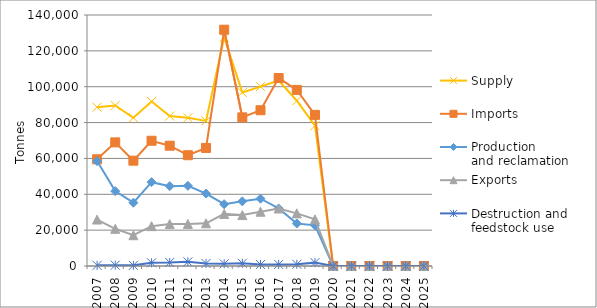
| Category | Supply | Imports | Production 
and reclamation | Exports | Destruction and 
feedstock use |
|---|---|---|---|---|---|
| 2007.0 | 88586.168 | 59518.488 | 58514.898 | 25914.962 | 349.388 |
| 2008.0 | 89568.834 | 68948.237 | 41757.375 | 20742.233 | 478.922 |
| 2009.0 | 82680.854 | 58746.203 | 35299.543 | 17168.292 | 356.814 |
| 2010.0 | 91748.751 | 69858.093 | 46766.357 | 22232.764 | 1803.092 |
| 2011.0 | 83620.143 | 67093.941 | 44538.196 | 23382.669 | 1954.313 |
| 2012.0 | 82714.977 | 61786.639 | 44707.01 | 23447.825 | 2332.416 |
| 2013.0 | 80898.028 | 65859.096 | 40393.482 | 23822.384 | 1403.708 |
| 2014.0 | 127547.487 | 131793.773 | 34465.136 | 29065.442 | 1219.142 |
| 2015.0 | 96778.587 | 82909.594 | 36055.884 | 28417.149 | 1514.209 |
| 2016.0 | 100050.222 | 86878.029 | 37522.776 | 30273.957 | 862.517 |
| 2017.0 | 103475.212 | 104835.12 | 32095.671 | 32104.503 | 891.354 |
| 2018.0 | 92179.243 | 98223.01 | 23720.248 | 29349.977 | 941.464 |
| 2019.0 | 78292.856 | 84284.156 | 22682.823 | 26033.29 | 1877.755 |
| 2020.0 | 0 | 0 | 0 | 0 | 0 |
| 2021.0 | 0 | 0 | 0 | 0 | 0 |
| 2022.0 | 0 | 0 | 0 | 0 | 0 |
| 2023.0 | 0 | 0 | 0 | 0 | 0 |
| 2024.0 | 0 | 0 | 0 | 0 | 0 |
| 2025.0 | 0 | 0 | 0 | 0 | 0 |